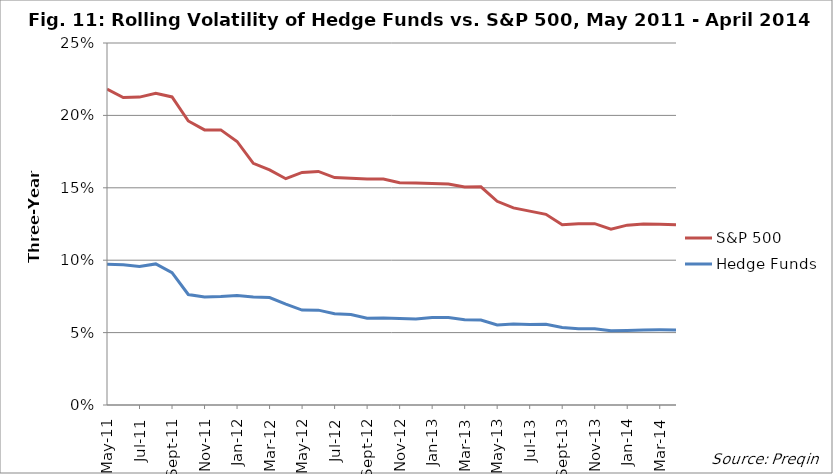
| Category | S&P 500 | Hedge Funds |
|---|---|---|
| 2011-05-31 | 0.218 | 0.097 |
| 2011-06-30 | 0.212 | 0.097 |
| 2011-07-31 | 0.213 | 0.096 |
| 2011-08-31 | 0.215 | 0.097 |
| 2011-09-30 | 0.213 | 0.091 |
| 2011-10-31 | 0.196 | 0.076 |
| 2011-11-30 | 0.19 | 0.075 |
| 2011-12-31 | 0.19 | 0.075 |
| 2012-01-31 | 0.182 | 0.076 |
| 2012-02-29 | 0.167 | 0.075 |
| 2012-03-31 | 0.162 | 0.074 |
| 2012-04-30 | 0.156 | 0.07 |
| 2012-05-31 | 0.161 | 0.066 |
| 2012-06-30 | 0.161 | 0.066 |
| 2012-07-31 | 0.157 | 0.063 |
| 2012-08-31 | 0.157 | 0.062 |
| 2012-09-30 | 0.156 | 0.06 |
| 2012-10-31 | 0.156 | 0.06 |
| 2012-11-30 | 0.153 | 0.06 |
| 2012-12-31 | 0.153 | 0.059 |
| 2013-01-31 | 0.153 | 0.06 |
| 2013-02-28 | 0.153 | 0.06 |
| 2013-03-31 | 0.151 | 0.059 |
| 2013-04-30 | 0.151 | 0.059 |
| 2013-05-31 | 0.141 | 0.055 |
| 2013-06-30 | 0.136 | 0.056 |
| 2013-07-31 | 0.134 | 0.056 |
| 2013-08-31 | 0.132 | 0.056 |
| 2013-09-30 | 0.125 | 0.053 |
| 2013-10-31 | 0.125 | 0.053 |
| 2013-11-30 | 0.125 | 0.053 |
| 2013-12-31 | 0.121 | 0.051 |
| 2014-01-31 | 0.124 | 0.051 |
| 2014-02-28 | 0.125 | 0.052 |
| 2014-03-31 | 0.125 | 0.052 |
| 2014-04-30 | 0.124 | 0.052 |